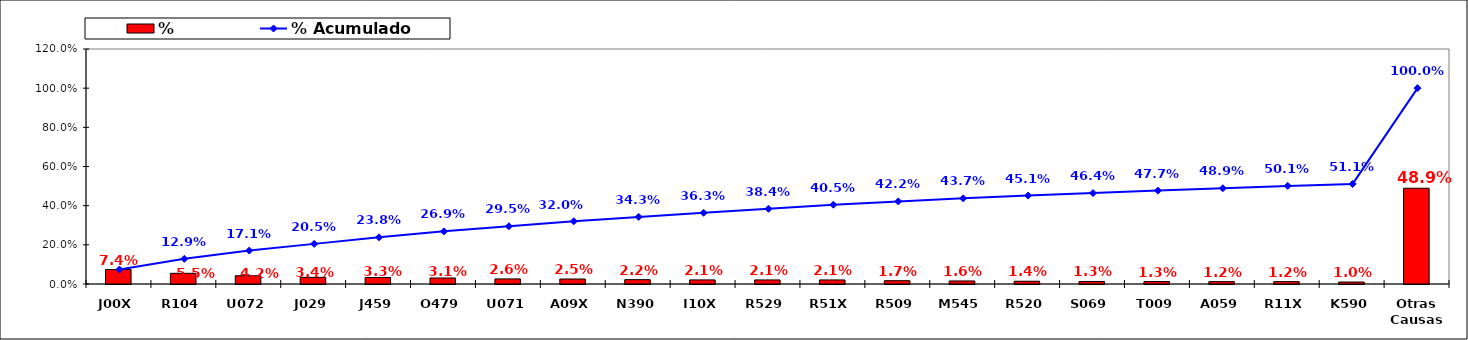
| Category | % |
|---|---|
| J00X | 0.074 |
| R104 | 0.055 |
| U072 | 0.042 |
| J029 | 0.034 |
| J459 | 0.033 |
| O479 | 0.031 |
| U071 | 0.026 |
| A09X | 0.025 |
| N390 | 0.022 |
| I10X | 0.021 |
| R529 | 0.021 |
| R51X | 0.021 |
| R509 | 0.017 |
| M545 | 0.016 |
| R520 | 0.014 |
| S069 | 0.013 |
| T009 | 0.013 |
| A059 | 0.012 |
| R11X | 0.012 |
| K590 | 0.01 |
| Otras Causas | 0.489 |